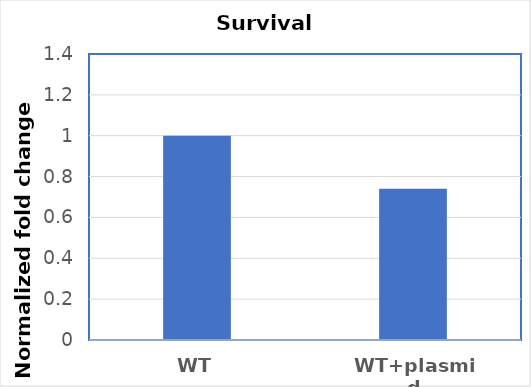
| Category | Series 0 |
|---|---|
| WT | 1 |
| WT+plasmid | 0.74 |